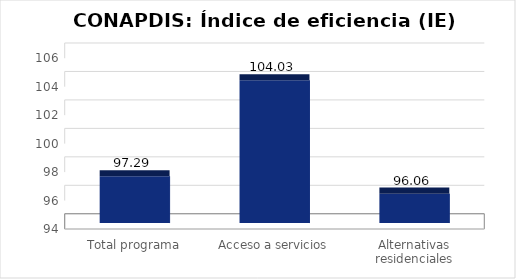
| Category | Índice de eficiencia (IE)  |
|---|---|
| Total programa | 97.287 |
| Acceso a servicios | 104.029 |
| Alternativas residenciales | 96.061 |